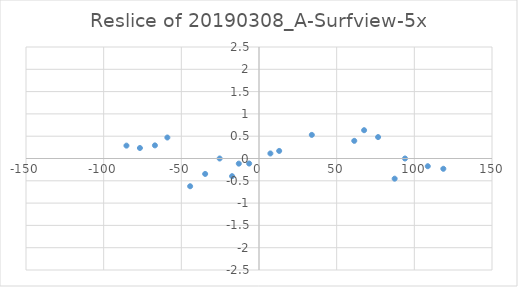
| Category | Reslice of 20190308_A-Surfview-5x |
|---|---|
| -44.333333333333336 | -0.622 |
| 87.33333333333333 | -0.452 |
| -17.333333333333332 | -0.396 |
| -34.666666666666664 | -0.346 |
| 118.66666666666667 | -0.231 |
| 108.66666666666667 | -0.173 |
| -13.0 | -0.115 |
| -6.333333333333333 | -0.113 |
| -25.333333333333332 | 0 |
| 94.0 | 0 |
| 7.333333333333333 | 0.113 |
| 13.0 | 0.17 |
| -76.66666666666667 | 0.235 |
| -85.33333333333333 | 0.288 |
| -67.0 | 0.294 |
| 61.333333333333336 | 0.396 |
| -59.0 | 0.471 |
| 76.66666666666667 | 0.48 |
| 34.0 | 0.529 |
| 67.66666666666667 | 0.634 |